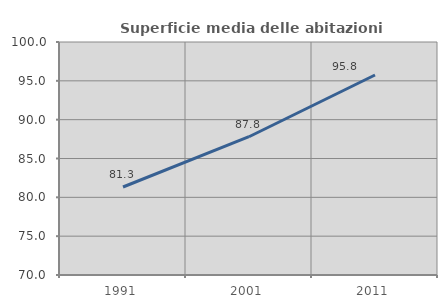
| Category | Superficie media delle abitazioni occupate |
|---|---|
| 1991.0 | 81.329 |
| 2001.0 | 87.804 |
| 2011.0 | 95.752 |